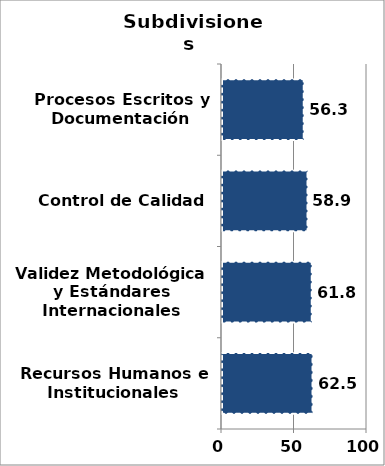
| Category | Series 0 |
|---|---|
| Recursos Humanos e Institucionales | 62.452 |
| Validez Metodológica y Estándares Internacionales | 61.843 |
| Control de Calidad | 58.935 |
| Procesos Escritos y Documentación | 56.329 |